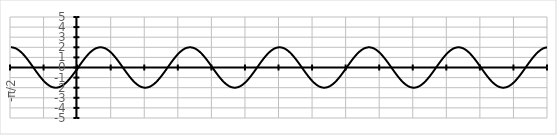
| Category | Series 0 |
|---|---|
| -π/2 | 2 |
|  | 1.997 |
|  | 1.989 |
|  | 1.975 |
|  | 1.956 |
|  | 1.932 |
|  | 1.902 |
|  | 1.867 |
|  | 1.827 |
|  | 1.782 |
|  | 1.732 |
|  | 1.677 |
|  | 1.618 |
|  | 1.554 |
|  | 1.486 |
|  | 1.414 |
|  | 1.338 |
|  | 1.259 |
|  | 1.176 |
|  | 1.089 |
|  | 1 |
|  | 0.908 |
|  | 0.813 |
|  | 0.717 |
|  | 0.618 |
|  | 0.518 |
|  | 0.416 |
|  | 0.313 |
|  | 0.209 |
|  | 0.105 |
|  | 0 |
|  | -0.105 |
|  | -0.209 |
|  | -0.313 |
|  | -0.416 |
|  | -0.518 |
|  | -0.618 |
|  | -0.717 |
|  | -0.813 |
|  | -0.908 |
|  | -1 |
|  | -1.089 |
|  | -1.176 |
|  | -1.259 |
|  | -1.338 |
|   | -1.414 |
|  | -1.486 |
|  | -1.554 |
|  | -1.618 |
|  | -1.677 |
|  | -1.732 |
|  | -1.782 |
|  | -1.827 |
|  | -1.867 |
|  | -1.902 |
|  | -1.932 |
|  | -1.956 |
|  | -1.975 |
|  | -1.989 |
|  | -1.997 |
|  | -2 |
|  | -1.997 |
|  | -1.989 |
|  | -1.975 |
|  | -1.956 |
|  | -1.932 |
|  | -1.902 |
|  | -1.867 |
|  | -1.827 |
|  | -1.782 |
|  | -1.732 |
|  | -1.677 |
|  | -1.618 |
|  | -1.554 |
|  | -1.486 |
|  | -1.414 |
|  | -1.338 |
|  | -1.259 |
|  | -1.176 |
|  | -1.089 |
|  | -1 |
|  | -0.908 |
|  | -0.813 |
|  | -0.717 |
|  | -0.618 |
|  | -0.518 |
|  | -0.416 |
|  | -0.313 |
|  | -0.209 |
|  | -0.105 |
| 0 | 0 |
|  | 0.105 |
|  | 0.209 |
|  | 0.313 |
|  | 0.416 |
|  | 0.518 |
|  | 0.618 |
|  | 0.717 |
|  | 0.813 |
|  | 0.908 |
|  | 1 |
|  | 1.089 |
|  | 1.176 |
|  | 1.259 |
|  | 1.338 |
|  | 1.414 |
|  | 1.486 |
|  | 1.554 |
|  | 1.618 |
|  | 1.677 |
|  | 1.732 |
|  | 1.782 |
|  | 1.827 |
|  | 1.867 |
|  | 1.902 |
|  | 1.932 |
|  | 1.956 |
|  | 1.975 |
|  | 1.989 |
|  | 1.997 |
|  | 2 |
|  | 1.997 |
|  | 1.989 |
|  | 1.975 |
|  | 1.956 |
|  | 1.932 |
|  | 1.902 |
|  | 1.867 |
|  | 1.827 |
|  | 1.782 |
|  | 1.732 |
|  | 1.677 |
|  | 1.618 |
|  | 1.554 |
|  | 1.486 |
|   | 1.414 |
|  | 1.338 |
|  | 1.259 |
|  | 1.176 |
|  | 1.089 |
|  | 1 |
|  | 0.908 |
|  | 0.813 |
|  | 0.717 |
|  | 0.618 |
|  | 0.518 |
|  | 0.416 |
|  | 0.313 |
|  | 0.209 |
|  | 0.105 |
|  | 0 |
|  | -0.105 |
|  | -0.209 |
|  | -0.313 |
|  | -0.416 |
|  | -0.518 |
|  | -0.618 |
|  | -0.717 |
|  | -0.813 |
|  | -0.908 |
|  | -1 |
|  | -1.089 |
|  | -1.176 |
|  | -1.259 |
|  | -1.338 |
|  | -1.414 |
|  | -1.486 |
|  | -1.554 |
|  | -1.618 |
|  | -1.677 |
|  | -1.732 |
|  | -1.782 |
|  | -1.827 |
|  | -1.867 |
|  | -1.902 |
|  | -1.932 |
|  | -1.956 |
|  | -1.975 |
|  | -1.989 |
|  | -1.997 |
| π/2 | -2 |
|  | -1.997 |
|  | -1.989 |
|  | -1.975 |
|  | -1.956 |
|  | -1.932 |
|  | -1.902 |
|  | -1.867 |
|  | -1.827 |
|  | -1.782 |
|  | -1.732 |
|  | -1.677 |
|  | -1.618 |
|  | -1.554 |
|  | -1.486 |
|  | -1.414 |
|  | -1.338 |
|  | -1.259 |
|  | -1.176 |
|  | -1.089 |
|  | -1 |
|  | -0.908 |
|  | -0.813 |
|  | -0.717 |
|  | -0.618 |
|  | -0.518 |
|  | -0.416 |
|  | -0.313 |
|  | -0.209 |
|  | -0.105 |
|  | 0 |
|  | 0.105 |
|  | 0.209 |
|  | 0.313 |
|  | 0.416 |
|  | 0.518 |
|  | 0.618 |
|  | 0.717 |
|  | 0.813 |
|  | 0.908 |
|  | 1 |
|  | 1.089 |
|  | 1.176 |
|  | 1.259 |
|  | 1.338 |
|   | 1.414 |
|  | 1.486 |
|  | 1.554 |
|  | 1.618 |
|  | 1.677 |
|  | 1.732 |
|  | 1.782 |
|  | 1.827 |
|  | 1.867 |
|  | 1.902 |
|  | 1.932 |
|  | 1.956 |
|  | 1.975 |
|  | 1.989 |
|  | 1.997 |
|  | 2 |
|  | 1.997 |
|  | 1.989 |
|  | 1.975 |
|  | 1.956 |
|  | 1.932 |
|  | 1.902 |
|  | 1.867 |
|  | 1.827 |
|  | 1.782 |
|  | 1.732 |
|  | 1.677 |
|  | 1.618 |
|  | 1.554 |
|  | 1.486 |
|  | 1.414 |
|  | 1.338 |
|  | 1.259 |
|  | 1.176 |
|  | 1.089 |
|  | 1 |
|  | 0.908 |
|  | 0.813 |
|  | 0.717 |
|  | 0.618 |
|  | 0.518 |
|  | 0.416 |
|  | 0.313 |
|  | 0.209 |
|  | 0.105 |
| π | 0 |
|  | -0.105 |
|  | -0.209 |
|  | -0.313 |
|  | -0.416 |
|  | -0.518 |
|  | -0.618 |
|  | -0.717 |
|  | -0.813 |
|  | -0.908 |
|  | -1 |
|  | -1.089 |
|  | -1.176 |
|  | -1.259 |
|  | -1.338 |
|  | -1.414 |
|  | -1.486 |
|  | -1.554 |
|  | -1.618 |
|  | -1.677 |
|  | -1.732 |
|  | -1.782 |
|  | -1.827 |
|  | -1.867 |
|  | -1.902 |
|  | -1.932 |
|  | -1.956 |
|  | -1.975 |
|  | -1.989 |
|  | -1.997 |
|  | -2 |
|  | -1.997 |
|  | -1.989 |
|  | -1.975 |
|  | -1.956 |
|  | -1.932 |
|  | -1.902 |
|  | -1.867 |
|  | -1.827 |
|  | -1.782 |
|  | -1.732 |
|  | -1.677 |
|  | -1.618 |
|  | -1.554 |
|  | -1.486 |
|   | -1.414 |
|  | -1.338 |
|  | -1.259 |
|  | -1.176 |
|  | -1.089 |
|  | -1 |
|  | -0.908 |
|  | -0.813 |
|  | -0.717 |
|  | -0.618 |
|  | -0.518 |
|  | -0.416 |
|  | -0.313 |
|  | -0.209 |
|  | -0.105 |
|  | 0 |
|  | 0.105 |
|  | 0.209 |
|  | 0.313 |
|  | 0.416 |
|  | 0.518 |
|  | 0.618 |
|  | 0.717 |
|  | 0.813 |
|  | 0.908 |
|  | 1 |
|  | 1.089 |
|  | 1.176 |
|  | 1.259 |
|  | 1.338 |
|  | 1.414 |
|  | 1.486 |
|  | 1.554 |
|  | 1.618 |
|  | 1.677 |
|  | 1.732 |
|  | 1.782 |
|  | 1.827 |
|  | 1.867 |
|  | 1.902 |
|  | 1.932 |
|  | 1.956 |
|  | 1.975 |
|  | 1.989 |
|  | 1.997 |
| 3π/2 | 2 |
|  | 1.997 |
|  | 1.989 |
|  | 1.975 |
|  | 1.956 |
|  | 1.932 |
|  | 1.902 |
|  | 1.867 |
|  | 1.827 |
|  | 1.782 |
|  | 1.732 |
|  | 1.677 |
|  | 1.618 |
|  | 1.554 |
|  | 1.486 |
|  | 1.414 |
|  | 1.338 |
|  | 1.259 |
|  | 1.176 |
|  | 1.089 |
|  | 1 |
|  | 0.908 |
|  | 0.813 |
|  | 0.717 |
|  | 0.618 |
|  | 0.518 |
|  | 0.416 |
|  | 0.313 |
|  | 0.209 |
|  | 0.105 |
|  | 0 |
|  | -0.105 |
|  | -0.209 |
|  | -0.313 |
|  | -0.416 |
|  | -0.518 |
|  | -0.618 |
|  | -0.717 |
|  | -0.813 |
|  | -0.908 |
|  | -1 |
|  | -1.089 |
|  | -1.176 |
|  | -1.259 |
|  | -1.338 |
|   | -1.414 |
|  | -1.486 |
|  | -1.554 |
|  | -1.618 |
|  | -1.677 |
|  | -1.732 |
|  | -1.782 |
|  | -1.827 |
|  | -1.867 |
|  | -1.902 |
|  | -1.932 |
|  | -1.956 |
|  | -1.975 |
|  | -1.989 |
|  | -1.997 |
|  | -2 |
|  | -1.997 |
|  | -1.989 |
|  | -1.975 |
|  | -1.956 |
|  | -1.932 |
|  | -1.902 |
|  | -1.867 |
|  | -1.827 |
|  | -1.782 |
|  | -1.732 |
|  | -1.677 |
|  | -1.618 |
|  | -1.554 |
|  | -1.486 |
|  | -1.414 |
|  | -1.338 |
|  | -1.259 |
|  | -1.176 |
|  | -1.089 |
|  | -1 |
|  | -0.908 |
|  | -0.813 |
|  | -0.717 |
|  | -0.618 |
|  | -0.518 |
|  | -0.416 |
|  | -0.313 |
|  | -0.209 |
|  | -0.105 |
| 2π | 0 |
|  | 0.105 |
|  | 0.209 |
|  | 0.313 |
|  | 0.416 |
|  | 0.518 |
|  | 0.618 |
|  | 0.717 |
|  | 0.813 |
|  | 0.908 |
|  | 1 |
|  | 1.089 |
|  | 1.176 |
|  | 1.259 |
|  | 1.338 |
|  | 1.414 |
|  | 1.486 |
|  | 1.554 |
|  | 1.618 |
|  | 1.677 |
|  | 1.732 |
|  | 1.782 |
|  | 1.827 |
|  | 1.867 |
|  | 1.902 |
|  | 1.932 |
|  | 1.956 |
|  | 1.975 |
|  | 1.989 |
|  | 1.997 |
|  | 2 |
|  | 1.997 |
|  | 1.989 |
|  | 1.975 |
|  | 1.956 |
|  | 1.932 |
|  | 1.902 |
|  | 1.867 |
|  | 1.827 |
|  | 1.782 |
|  | 1.732 |
|  | 1.677 |
|  | 1.618 |
|  | 1.554 |
|  | 1.486 |
|   | 1.414 |
|  | 1.338 |
|  | 1.259 |
|  | 1.176 |
|  | 1.089 |
|  | 1 |
|  | 0.908 |
|  | 0.813 |
|  | 0.717 |
|  | 0.618 |
|  | 0.518 |
|  | 0.416 |
|  | 0.313 |
|  | 0.209 |
|  | 0.105 |
|  | 0 |
|  | -0.105 |
|  | -0.209 |
|  | -0.313 |
|  | -0.416 |
|  | -0.518 |
|  | -0.618 |
|  | -0.717 |
|  | -0.813 |
|  | -0.908 |
|  | -1 |
|  | -1.089 |
|  | -1.176 |
|  | -1.259 |
|  | -1.338 |
|  | -1.414 |
|  | -1.486 |
|  | -1.554 |
|  | -1.618 |
|  | -1.677 |
|  | -1.732 |
|  | -1.782 |
|  | -1.827 |
|  | -1.867 |
|  | -1.902 |
|  | -1.932 |
|  | -1.956 |
|  | -1.975 |
|  | -1.989 |
|  | -1.997 |
| 5π/2 | -2 |
|  | -1.997 |
|  | -1.989 |
|  | -1.975 |
|  | -1.956 |
|  | -1.932 |
|  | -1.902 |
|  | -1.867 |
|  | -1.827 |
|  | -1.782 |
|  | -1.732 |
|  | -1.677 |
|  | -1.618 |
|  | -1.554 |
|  | -1.486 |
|  | -1.414 |
|  | -1.338 |
|  | -1.259 |
|  | -1.176 |
|  | -1.089 |
|  | -1 |
|  | -0.908 |
|  | -0.813 |
|  | -0.717 |
|  | -0.618 |
|  | -0.518 |
|  | -0.416 |
|  | -0.313 |
|  | -0.209 |
|  | -0.105 |
|  | 0 |
|  | 0.105 |
|  | 0.209 |
|  | 0.313 |
|  | 0.416 |
|  | 0.518 |
|  | 0.618 |
|  | 0.717 |
|  | 0.813 |
|  | 0.908 |
|  | 1 |
|  | 1.089 |
|  | 1.176 |
|  | 1.259 |
|  | 1.338 |
|   | 1.414 |
|  | 1.486 |
|  | 1.554 |
|  | 1.618 |
|  | 1.677 |
|  | 1.732 |
|  | 1.782 |
|  | 1.827 |
|  | 1.867 |
|  | 1.902 |
|  | 1.932 |
|  | 1.956 |
|  | 1.975 |
|  | 1.989 |
|  | 1.997 |
|  | 2 |
|  | 1.997 |
|  | 1.989 |
|  | 1.975 |
|  | 1.956 |
|  | 1.932 |
|  | 1.902 |
|  | 1.867 |
|  | 1.827 |
|  | 1.782 |
|  | 1.732 |
|  | 1.677 |
|  | 1.618 |
|  | 1.554 |
|  | 1.486 |
|  | 1.414 |
|  | 1.338 |
|  | 1.259 |
|  | 1.176 |
|  | 1.089 |
|  | 1 |
|  | 0.908 |
|  | 0.813 |
|  | 0.717 |
|  | 0.618 |
|  | 0.518 |
|  | 0.416 |
|  | 0.313 |
|  | 0.209 |
|  | 0.105 |
| 3π | 0 |
|  | -0.105 |
|  | -0.209 |
|  | -0.313 |
|  | -0.416 |
|  | -0.518 |
|  | -0.618 |
|  | -0.717 |
|  | -0.813 |
|  | -0.908 |
|  | -1 |
|  | -1.089 |
|  | -1.176 |
|  | -1.259 |
|  | -1.338 |
|  | -1.414 |
|  | -1.486 |
|  | -1.554 |
|  | -1.618 |
|  | -1.677 |
|  | -1.732 |
|  | -1.782 |
|  | -1.827 |
|  | -1.867 |
|  | -1.902 |
|  | -1.932 |
|  | -1.956 |
|  | -1.975 |
|  | -1.989 |
|  | -1.997 |
|  | -2 |
|  | -1.997 |
|  | -1.989 |
|  | -1.975 |
|  | -1.956 |
|  | -1.932 |
|  | -1.902 |
|  | -1.867 |
|  | -1.827 |
|  | -1.782 |
|  | -1.732 |
|  | -1.677 |
|  | -1.618 |
|  | -1.554 |
|  | -1.486 |
|   | -1.414 |
|  | -1.338 |
|  | -1.259 |
|  | -1.176 |
|  | -1.089 |
|  | -1 |
|  | -0.908 |
|  | -0.813 |
|  | -0.717 |
|  | -0.618 |
|  | -0.518 |
|  | -0.416 |
|  | -0.313 |
|  | -0.209 |
|  | -0.105 |
|  | 0 |
|  | 0.105 |
|  | 0.209 |
|  | 0.313 |
|  | 0.416 |
|  | 0.518 |
|  | 0.618 |
|  | 0.717 |
|  | 0.813 |
|  | 0.908 |
|  | 1 |
|  | 1.089 |
|  | 1.176 |
|  | 1.259 |
|  | 1.338 |
|  | 1.414 |
|  | 1.486 |
|  | 1.554 |
|  | 1.618 |
|  | 1.677 |
|  | 1.732 |
|  | 1.782 |
|  | 1.827 |
|  | 1.867 |
|  | 1.902 |
|  | 1.932 |
|  | 1.956 |
|  | 1.975 |
|  | 1.989 |
|  | 1.997 |
| 7π/2 | 2 |